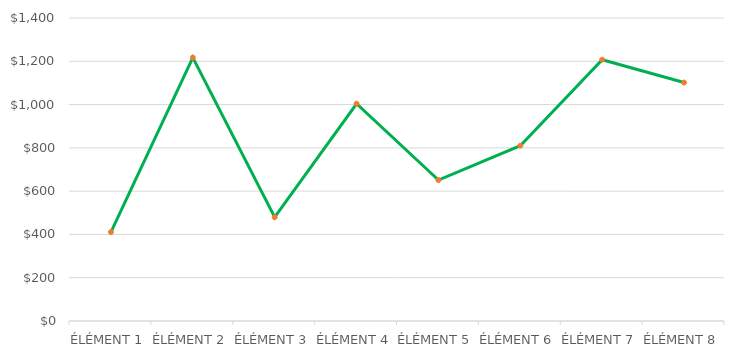
| Category | Series 1 |
|---|---|
| ÉLÉMENT 1 | 411.07 |
| ÉLÉMENT 2 | 1217.065 |
| ÉLÉMENT 3 | 479.5 |
| ÉLÉMENT 4 | 1003.75 |
| ÉLÉMENT 5 | 651 |
| ÉLÉMENT 6 | 810 |
| ÉLÉMENT 7 | 1207.25 |
| ÉLÉMENT 8 | 1101.76 |